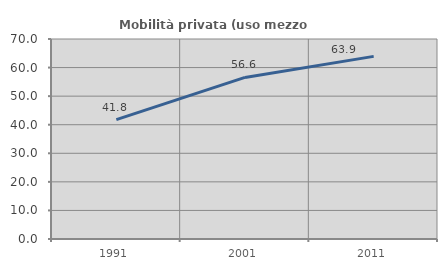
| Category | Mobilità privata (uso mezzo privato) |
|---|---|
| 1991.0 | 41.769 |
| 2001.0 | 56.557 |
| 2011.0 | 63.913 |